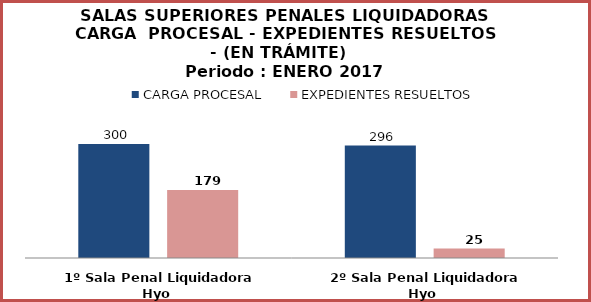
| Category | CARGA PROCESAL | EXPEDIENTES RESUELTOS |
|---|---|---|
| 1º Sala Penal Liquidadora Hyo | 300 | 179 |
| 2º Sala Penal Liquidadora Hyo | 296 | 25 |